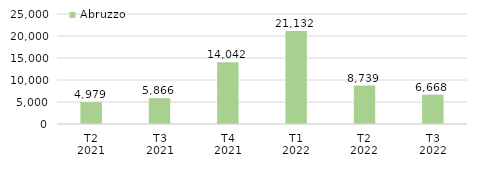
| Category | Abruzzo |
|---|---|
| T2
2021 | 4978.78 |
| T3
2021 | 5865.63 |
| T4
2021 | 14042.38 |
| T1
2022 | 21131.544 |
| T2
2022 | 8739.033 |
| T3
2022 | 6667.859 |